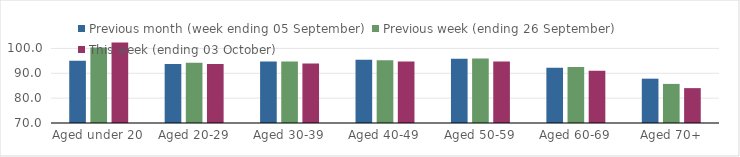
| Category | Previous month (week ending 05 September) | Previous week (ending 26 September) | This week (ending 03 October) |
|---|---|---|---|
| Aged under 20 | 95.01 | 100.34 | 102.4 |
| Aged 20-29 | 93.72 | 94.19 | 93.78 |
| Aged 30-39 | 94.73 | 94.7 | 93.9 |
| Aged 40-49 | 95.44 | 95.21 | 94.7 |
| Aged 50-59 | 95.85 | 95.97 | 94.78 |
| Aged 60-69 | 92.24 | 92.49 | 90.97 |
| Aged 70+ | 87.83 | 85.73 | 84.03 |